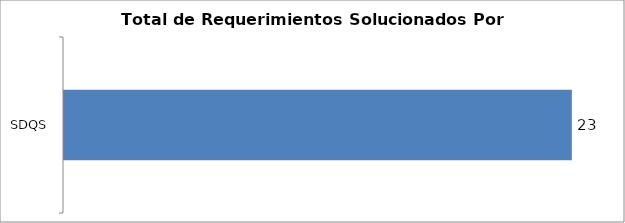
| Category | Total |
|---|---|
| SDQS | 23 |